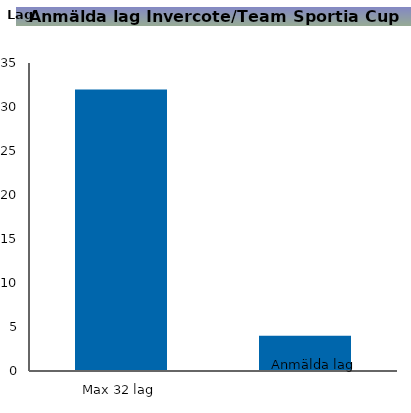
| Category | Anmälda lag  |
|---|---|
| 0 | 32 |
| 1 | 4 |